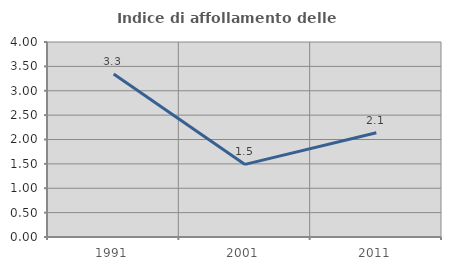
| Category | Indice di affollamento delle abitazioni  |
|---|---|
| 1991.0 | 3.343 |
| 2001.0 | 1.489 |
| 2011.0 | 2.138 |